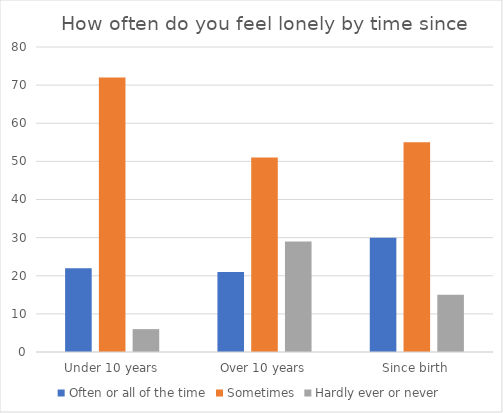
| Category | Often or all of the time | Sometimes | Hardly ever or never |
|---|---|---|---|
| Under 10 years | 22 | 72 | 6 |
| Over 10 years | 21 | 51 | 29 |
| Since birth | 30 | 55 | 15 |